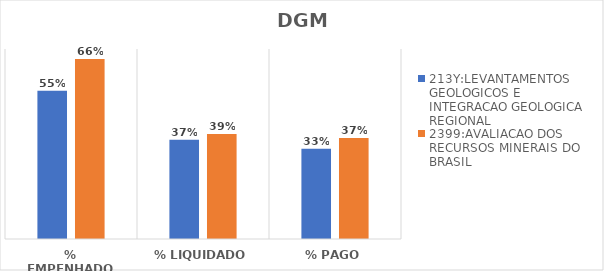
| Category | 213Y:LEVANTAMENTOS GEOLOGICOS E INTEGRACAO GEOLOGICA REGIONAL | 2399:AVALIACAO DOS RECURSOS MINERAIS DO BRASIL |
|---|---|---|
| % EMPENHADO | 0.546 | 0.663 |
| % LIQUIDADO | 0.365 | 0.387 |
| % PAGO | 0.332 | 0.372 |